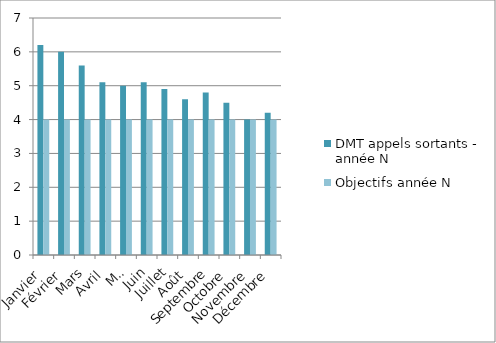
| Category | DMT appels sortants - année N | Objectifs année N |
|---|---|---|
| Janvier | 6.2 | 4 |
| Février | 6 | 4 |
| Mars | 5.6 | 4 |
| Avril | 5.1 | 4 |
| Mai | 5 | 4 |
| Juin | 5.1 | 4 |
| Juillet | 4.9 | 4 |
| Août | 4.6 | 4 |
| Septembre | 4.8 | 4 |
| Octobre | 4.5 | 4 |
| Novembre | 4 | 4 |
| Décembre | 4.2 | 4 |